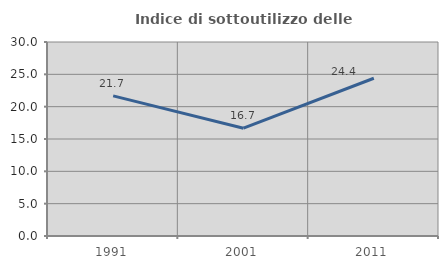
| Category | Indice di sottoutilizzo delle abitazioni  |
|---|---|
| 1991.0 | 21.667 |
| 2001.0 | 16.667 |
| 2011.0 | 24.397 |